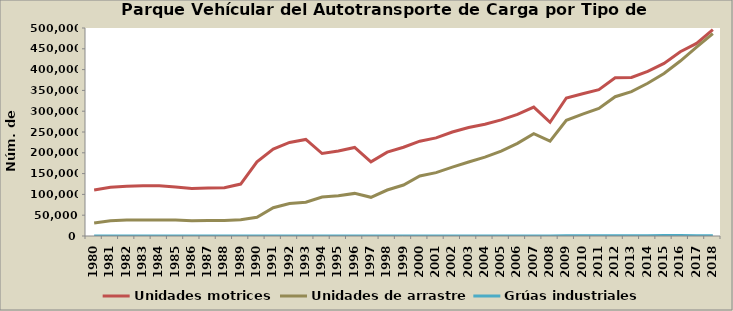
| Category | Unidades motrices | Unidades de arrastre | Grúas industriales |
|---|---|---|---|
| 1980.0 | 110810 | 31120 | 0 |
| 1981.0 | 117090 | 36760 | 0 |
| 1982.0 | 119309 | 38216 | 0 |
| 1983.0 | 120702 | 38639 | 0 |
| 1984.0 | 120702 | 38639 | 0 |
| 1985.0 | 117956 | 38317 | 0 |
| 1986.0 | 114000 | 36500 | 0 |
| 1987.0 | 115092 | 37245 | 0 |
| 1988.0 | 115897 | 37506 | 0 |
| 1989.0 | 124897 | 39113 | 0 |
| 1990.0 | 178130 | 44853 | 0 |
| 1991.0 | 209060 | 67865 | 0 |
| 1992.0 | 224913 | 78233 | 0 |
| 1993.0 | 232203 | 81307 | 0 |
| 1994.0 | 198273 | 93827 | 0 |
| 1995.0 | 204117 | 96638 | 0 |
| 1996.0 | 212909 | 102409 | 0 |
| 1997.0 | 178332 | 92999 | 0 |
| 1998.0 | 201587 | 110530 | 0 |
| 1999.0 | 213292 | 122619 | 126 |
| 2000.0 | 227847 | 144225 | 191 |
| 2001.0 | 235767 | 152341 | 212 |
| 2002.0 | 250025 | 165601 | 221 |
| 2003.0 | 260645 | 177864 | 251 |
| 2004.0 | 268725 | 189568 | 256 |
| 2005.0 | 279112 | 204186 | 266 |
| 2006.0 | 292418 | 222580 | 281 |
| 2007.0 | 310013 | 245843 | 294 |
| 2008.0 | 273455 | 227806 | 277 |
| 2009.0 | 331686 | 278133 | 329 |
| 2010.0 | 342064 | 293053 | 351 |
| 2011.0 | 351705 | 306700 | 355 |
| 2012.0 | 380342 | 334858 | 483 |
| 2013.0 | 381250 | 347112 | 684 |
| 2014.0 | 395552 | 367051 | 877 |
| 2015.0 | 414790 | 390563 | 1052 |
| 2016.0 | 443058 | 420553 | 1224 |
| 2017.0 | 463016 | 453916 | 449 |
| 2018.0 | 496057 | 486335 | 464 |